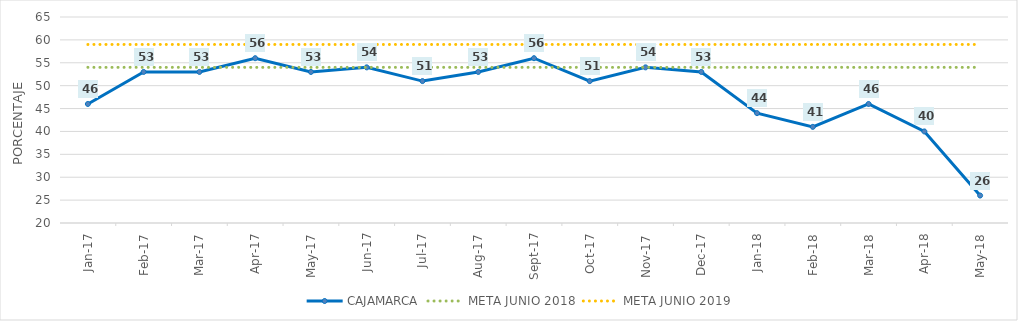
| Category | CAJAMARCA | META JUNIO 2018 | META JUNIO 2019 |
|---|---|---|---|
| 2017-01-01 | 46 | 54 | 59 |
| 2017-02-01 | 53 | 54 | 59 |
| 2017-03-01 | 53 | 54 | 59 |
| 2017-04-01 | 56 | 54 | 59 |
| 2017-05-01 | 53 | 54 | 59 |
| 2017-06-01 | 54 | 54 | 59 |
| 2017-07-01 | 51 | 54 | 59 |
| 2017-08-01 | 53 | 54 | 59 |
| 2017-09-01 | 56 | 54 | 59 |
| 2017-10-01 | 51 | 54 | 59 |
| 2017-11-01 | 54 | 54 | 59 |
| 2017-12-01 | 53 | 54 | 59 |
| 2018-01-01 | 44 | 54 | 59 |
| 2018-02-01 | 41 | 54 | 59 |
| 2018-03-01 | 46 | 54 | 59 |
| 2018-04-01 | 40 | 54 | 59 |
| 2018-05-01 | 26 | 54 | 59 |